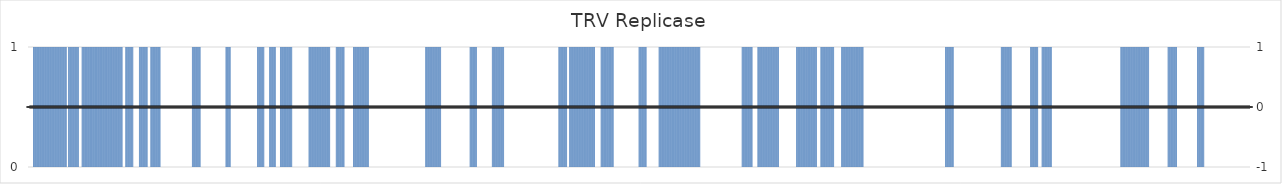
| Category | TRV Replicase |
|---|---|
| 1.0 | 0 |
| 2.0 | 0 |
| 3.0 | 0 |
| 4.0 | 0 |
| 5.0 | 0 |
| 6.0 | 0 |
| 7.0 | 0 |
| 8.0 | 1 |
| 9.0 | 1 |
| 10.0 | 1 |
| 11.0 | 1 |
| 12.0 | 1 |
| 13.0 | 1 |
| 14.0 | 1 |
| 15.0 | 1 |
| 16.0 | 1 |
| 17.0 | 1 |
| 18.0 | 1 |
| 19.0 | 1 |
| 20.0 | 1 |
| 21.0 | 1 |
| 22.0 | 1 |
| 23.0 | 1 |
| 24.0 | 1 |
| 25.0 | 1 |
| 26.0 | 1 |
| 27.0 | 1 |
| 28.0 | 1 |
| 29.0 | 1 |
| 30.0 | 1 |
| 31.0 | 1 |
| 32.0 | 1 |
| 33.0 | 1 |
| 34.0 | 1 |
| 35.0 | 1 |
| 36.0 | 1 |
| 37.0 | 1 |
| 38.0 | 1 |
| 39.0 | 1 |
| 40.0 | 1 |
| 41.0 | 1 |
| 42.0 | 1 |
| 43.0 | 1 |
| 44.0 | 1 |
| 45.0 | 1 |
| 46.0 | 1 |
| 47.0 | 1 |
| 48.0 | 1 |
| 49.0 | 1 |
| 50.0 | 1 |
| 51.0 | 1 |
| 52.0 | 1 |
| 53.0 | 1 |
| 54.0 | 1 |
| 55.0 | 0 |
| 56.0 | 0 |
| 57.0 | 1 |
| 58.0 | 1 |
| 59.0 | 1 |
| 60.0 | 1 |
| 61.0 | 1 |
| 62.0 | 1 |
| 63.0 | 1 |
| 64.0 | 1 |
| 65.0 | 1 |
| 66.0 | 1 |
| 67.0 | 1 |
| 68.0 | 1 |
| 69.0 | 1 |
| 70.0 | 1 |
| 71.0 | 1 |
| 72.0 | 0 |
| 73.0 | 0 |
| 74.0 | 0 |
| 75.0 | 0 |
| 76.0 | 1 |
| 77.0 | 1 |
| 78.0 | 1 |
| 79.0 | 1 |
| 80.0 | 1 |
| 81.0 | 1 |
| 82.0 | 1 |
| 83.0 | 1 |
| 84.0 | 1 |
| 85.0 | 1 |
| 86.0 | 1 |
| 87.0 | 1 |
| 88.0 | 1 |
| 89.0 | 1 |
| 90.0 | 1 |
| 91.0 | 1 |
| 92.0 | 1 |
| 93.0 | 1 |
| 94.0 | 1 |
| 95.0 | 1 |
| 96.0 | 1 |
| 97.0 | 1 |
| 98.0 | 1 |
| 99.0 | 1 |
| 100.0 | 1 |
| 101.0 | 1 |
| 102.0 | 1 |
| 103.0 | 1 |
| 104.0 | 1 |
| 105.0 | 1 |
| 106.0 | 1 |
| 107.0 | 1 |
| 108.0 | 1 |
| 109.0 | 1 |
| 110.0 | 1 |
| 111.0 | 1 |
| 112.0 | 1 |
| 113.0 | 1 |
| 114.0 | 1 |
| 115.0 | 1 |
| 116.0 | 1 |
| 117.0 | 1 |
| 118.0 | 1 |
| 119.0 | 1 |
| 120.0 | 1 |
| 121.0 | 1 |
| 122.0 | 1 |
| 123.0 | 1 |
| 124.0 | 1 |
| 125.0 | 1 |
| 126.0 | 1 |
| 127.0 | 1 |
| 128.0 | 1 |
| 129.0 | 1 |
| 130.0 | 1 |
| 131.0 | 1 |
| 132.0 | 1 |
| 133.0 | 0 |
| 134.0 | 0 |
| 135.0 | 0 |
| 136.0 | 0 |
| 137.0 | 1 |
| 138.0 | 1 |
| 139.0 | 1 |
| 140.0 | 1 |
| 141.0 | 1 |
| 142.0 | 1 |
| 143.0 | 1 |
| 144.0 | 1 |
| 145.0 | 1 |
| 146.0 | 1 |
| 147.0 | 1 |
| 148.0 | 0 |
| 149.0 | 0 |
| 150.0 | 0 |
| 151.0 | 0 |
| 152.0 | 0 |
| 153.0 | 0 |
| 154.0 | 0 |
| 155.0 | 0 |
| 156.0 | 1 |
| 157.0 | 1 |
| 158.0 | 1 |
| 159.0 | 1 |
| 160.0 | 1 |
| 161.0 | 1 |
| 162.0 | 1 |
| 163.0 | 1 |
| 164.0 | 1 |
| 165.0 | 1 |
| 166.0 | 1 |
| 167.0 | 1 |
| 168.0 | 0 |
| 169.0 | 0 |
| 170.0 | 0 |
| 171.0 | 0 |
| 172.0 | 1 |
| 173.0 | 1 |
| 174.0 | 1 |
| 175.0 | 1 |
| 176.0 | 1 |
| 177.0 | 1 |
| 178.0 | 1 |
| 179.0 | 1 |
| 180.0 | 1 |
| 181.0 | 1 |
| 182.0 | 1 |
| 183.0 | 1 |
| 184.0 | 1 |
| 185.0 | 1 |
| 186.0 | 0 |
| 187.0 | 0 |
| 188.0 | 0 |
| 189.0 | 0 |
| 190.0 | 0 |
| 191.0 | 0 |
| 192.0 | 0 |
| 193.0 | 0 |
| 194.0 | 0 |
| 195.0 | 0 |
| 196.0 | 0 |
| 197.0 | 0 |
| 198.0 | 0 |
| 199.0 | 0 |
| 200.0 | 0 |
| 201.0 | 0 |
| 202.0 | 0 |
| 203.0 | 0 |
| 204.0 | 0 |
| 205.0 | 0 |
| 206.0 | 0 |
| 207.0 | 0 |
| 208.0 | 0 |
| 209.0 | 0 |
| 210.0 | 0 |
| 211.0 | 0 |
| 212.0 | 0 |
| 213.0 | 0 |
| 214.0 | 0 |
| 215.0 | 0 |
| 216.0 | 0 |
| 217.0 | 0 |
| 218.0 | 0 |
| 219.0 | 0 |
| 220.0 | 0 |
| 221.0 | 0 |
| 222.0 | 0 |
| 223.0 | 0 |
| 224.0 | 0 |
| 225.0 | 0 |
| 226.0 | 0 |
| 227.0 | 0 |
| 228.0 | 0 |
| 229.0 | 0 |
| 230.0 | 1 |
| 231.0 | 1 |
| 232.0 | 1 |
| 233.0 | 1 |
| 234.0 | 1 |
| 235.0 | 1 |
| 236.0 | 1 |
| 237.0 | 1 |
| 238.0 | 1 |
| 239.0 | 1 |
| 240.0 | 1 |
| 241.0 | 1 |
| 242.0 | 0 |
| 243.0 | 0 |
| 244.0 | 0 |
| 245.0 | 0 |
| 246.0 | 0 |
| 247.0 | 0 |
| 248.0 | 0 |
| 249.0 | 0 |
| 250.0 | 0 |
| 251.0 | 0 |
| 252.0 | 0 |
| 253.0 | 0 |
| 254.0 | 0 |
| 255.0 | 0 |
| 256.0 | 0 |
| 257.0 | 0 |
| 258.0 | 0 |
| 259.0 | 0 |
| 260.0 | 0 |
| 261.0 | 0 |
| 262.0 | 0 |
| 263.0 | 0 |
| 264.0 | 0 |
| 265.0 | 0 |
| 266.0 | 0 |
| 267.0 | 0 |
| 268.0 | 0 |
| 269.0 | 0 |
| 270.0 | 0 |
| 271.0 | 0 |
| 272.0 | 0 |
| 273.0 | 0 |
| 274.0 | 0 |
| 275.0 | 0 |
| 276.0 | 0 |
| 277.0 | 1 |
| 278.0 | 1 |
| 279.0 | 1 |
| 280.0 | 1 |
| 281.0 | 1 |
| 282.0 | 1 |
| 283.0 | 1 |
| 284.0 | 0 |
| 285.0 | 0 |
| 286.0 | 0 |
| 287.0 | 0 |
| 288.0 | 0 |
| 289.0 | 0 |
| 290.0 | 0 |
| 291.0 | 0 |
| 292.0 | 0 |
| 293.0 | 0 |
| 294.0 | 0 |
| 295.0 | 0 |
| 296.0 | 0 |
| 297.0 | 0 |
| 298.0 | 0 |
| 299.0 | 0 |
| 300.0 | 0 |
| 301.0 | 0 |
| 302.0 | 0 |
| 303.0 | 0 |
| 304.0 | 0 |
| 305.0 | 0 |
| 306.0 | 0 |
| 307.0 | 0 |
| 308.0 | 0 |
| 309.0 | 0 |
| 310.0 | 0 |
| 311.0 | 0 |
| 312.0 | 0 |
| 313.0 | 0 |
| 314.0 | 0 |
| 315.0 | 0 |
| 316.0 | 0 |
| 317.0 | 0 |
| 318.0 | 0 |
| 319.0 | 0 |
| 320.0 | 0 |
| 321.0 | 1 |
| 322.0 | 1 |
| 323.0 | 1 |
| 324.0 | 1 |
| 325.0 | 1 |
| 326.0 | 1 |
| 327.0 | 1 |
| 328.0 | 1 |
| 329.0 | 1 |
| 330.0 | 1 |
| 331.0 | 0 |
| 332.0 | 0 |
| 333.0 | 0 |
| 334.0 | 0 |
| 335.0 | 0 |
| 336.0 | 0 |
| 337.0 | 0 |
| 338.0 | 1 |
| 339.0 | 1 |
| 340.0 | 1 |
| 341.0 | 1 |
| 342.0 | 1 |
| 343.0 | 1 |
| 344.0 | 1 |
| 345.0 | 1 |
| 346.0 | 1 |
| 347.0 | 0 |
| 348.0 | 0 |
| 349.0 | 0 |
| 350.0 | 0 |
| 351.0 | 0 |
| 352.0 | 0 |
| 353.0 | 1 |
| 354.0 | 1 |
| 355.0 | 1 |
| 356.0 | 1 |
| 357.0 | 1 |
| 358.0 | 1 |
| 359.0 | 1 |
| 360.0 | 1 |
| 361.0 | 1 |
| 362.0 | 1 |
| 363.0 | 1 |
| 364.0 | 1 |
| 365.0 | 1 |
| 366.0 | 1 |
| 367.0 | 1 |
| 368.0 | 1 |
| 369.0 | 1 |
| 370.0 | 0 |
| 371.0 | 0 |
| 372.0 | 0 |
| 373.0 | 0 |
| 374.0 | 0 |
| 375.0 | 0 |
| 376.0 | 0 |
| 377.0 | 0 |
| 378.0 | 0 |
| 379.0 | 0 |
| 380.0 | 0 |
| 381.0 | 0 |
| 382.0 | 0 |
| 383.0 | 0 |
| 384.0 | 0 |
| 385.0 | 0 |
| 386.0 | 0 |
| 387.0 | 0 |
| 388.0 | 0 |
| 389.0 | 0 |
| 390.0 | 0 |
| 391.0 | 0 |
| 392.0 | 0 |
| 393.0 | 1 |
| 394.0 | 1 |
| 395.0 | 1 |
| 396.0 | 1 |
| 397.0 | 1 |
| 398.0 | 1 |
| 399.0 | 1 |
| 400.0 | 1 |
| 401.0 | 1 |
| 402.0 | 1 |
| 403.0 | 1 |
| 404.0 | 1 |
| 405.0 | 1 |
| 406.0 | 1 |
| 407.0 | 1 |
| 408.0 | 1 |
| 409.0 | 1 |
| 410.0 | 1 |
| 411.0 | 1 |
| 412.0 | 1 |
| 413.0 | 1 |
| 414.0 | 1 |
| 415.0 | 1 |
| 416.0 | 1 |
| 417.0 | 1 |
| 418.0 | 1 |
| 419.0 | 1 |
| 420.0 | 1 |
| 421.0 | 1 |
| 422.0 | 1 |
| 423.0 | 0 |
| 424.0 | 0 |
| 425.0 | 0 |
| 426.0 | 0 |
| 427.0 | 0 |
| 428.0 | 0 |
| 429.0 | 0 |
| 430.0 | 0 |
| 431.0 | 1 |
| 432.0 | 1 |
| 433.0 | 1 |
| 434.0 | 1 |
| 435.0 | 1 |
| 436.0 | 1 |
| 437.0 | 1 |
| 438.0 | 1 |
| 439.0 | 1 |
| 440.0 | 1 |
| 441.0 | 1 |
| 442.0 | 1 |
| 443.0 | 0 |
| 444.0 | 0 |
| 445.0 | 0 |
| 446.0 | 0 |
| 447.0 | 0 |
| 448.0 | 0 |
| 449.0 | 0 |
| 450.0 | 0 |
| 451.0 | 0 |
| 452.0 | 0 |
| 453.0 | 0 |
| 454.0 | 0 |
| 455.0 | 1 |
| 456.0 | 1 |
| 457.0 | 1 |
| 458.0 | 1 |
| 459.0 | 1 |
| 460.0 | 1 |
| 461.0 | 1 |
| 462.0 | 1 |
| 463.0 | 1 |
| 464.0 | 1 |
| 465.0 | 1 |
| 466.0 | 1 |
| 467.0 | 1 |
| 468.0 | 1 |
| 469.0 | 1 |
| 470.0 | 1 |
| 471.0 | 1 |
| 472.0 | 1 |
| 473.0 | 1 |
| 474.0 | 1 |
| 475.0 | 1 |
| 476.0 | 1 |
| 477.0 | 0 |
| 478.0 | 0 |
| 479.0 | 0 |
| 480.0 | 0 |
| 481.0 | 0 |
| 482.0 | 0 |
| 483.0 | 0 |
| 484.0 | 0 |
| 485.0 | 0 |
| 486.0 | 0 |
| 487.0 | 0 |
| 488.0 | 0 |
| 489.0 | 0 |
| 490.0 | 0 |
| 491.0 | 0 |
| 492.0 | 0 |
| 493.0 | 0 |
| 494.0 | 0 |
| 495.0 | 0 |
| 496.0 | 0 |
| 497.0 | 0 |
| 498.0 | 0 |
| 499.0 | 0 |
| 500.0 | 0 |
| 501.0 | 0 |
| 502.0 | 0 |
| 503.0 | 0 |
| 504.0 | 0 |
| 505.0 | 0 |
| 506.0 | 0 |
| 507.0 | 0 |
| 508.0 | 0 |
| 509.0 | 0 |
| 510.0 | 0 |
| 511.0 | 0 |
| 512.0 | 0 |
| 513.0 | 0 |
| 514.0 | 0 |
| 515.0 | 0 |
| 516.0 | 0 |
| 517.0 | 0 |
| 518.0 | 0 |
| 519.0 | 0 |
| 520.0 | 0 |
| 521.0 | 0 |
| 522.0 | 0 |
| 523.0 | 0 |
| 524.0 | 0 |
| 525.0 | 0 |
| 526.0 | 0 |
| 527.0 | 0 |
| 528.0 | 0 |
| 529.0 | 0 |
| 530.0 | 0 |
| 531.0 | 0 |
| 532.0 | 0 |
| 533.0 | 0 |
| 534.0 | 0 |
| 535.0 | 0 |
| 536.0 | 0 |
| 537.0 | 0 |
| 538.0 | 0 |
| 539.0 | 0 |
| 540.0 | 0 |
| 541.0 | 0 |
| 542.0 | 0 |
| 543.0 | 0 |
| 544.0 | 0 |
| 545.0 | 0 |
| 546.0 | 0 |
| 547.0 | 0 |
| 548.0 | 0 |
| 549.0 | 0 |
| 550.0 | 0 |
| 551.0 | 0 |
| 552.0 | 0 |
| 553.0 | 0 |
| 554.0 | 0 |
| 555.0 | 0 |
| 556.0 | 1 |
| 557.0 | 1 |
| 558.0 | 1 |
| 559.0 | 1 |
| 560.0 | 1 |
| 561.0 | 1 |
| 562.0 | 1 |
| 563.0 | 1 |
| 564.0 | 1 |
| 565.0 | 1 |
| 566.0 | 1 |
| 567.0 | 1 |
| 568.0 | 1 |
| 569.0 | 1 |
| 570.0 | 1 |
| 571.0 | 1 |
| 572.0 | 1 |
| 573.0 | 1 |
| 574.0 | 1 |
| 575.0 | 1 |
| 576.0 | 1 |
| 577.0 | 1 |
| 578.0 | 0 |
| 579.0 | 0 |
| 580.0 | 0 |
| 581.0 | 0 |
| 582.0 | 0 |
| 583.0 | 0 |
| 584.0 | 0 |
| 585.0 | 0 |
| 586.0 | 0 |
| 587.0 | 0 |
| 588.0 | 0 |
| 589.0 | 0 |
| 590.0 | 0 |
| 591.0 | 0 |
| 592.0 | 0 |
| 593.0 | 0 |
| 594.0 | 0 |
| 595.0 | 0 |
| 596.0 | 0 |
| 597.0 | 0 |
| 598.0 | 0 |
| 599.0 | 0 |
| 600.0 | 0 |
| 601.0 | 0 |
| 602.0 | 0 |
| 603.0 | 0 |
| 604.0 | 0 |
| 605.0 | 0 |
| 606.0 | 0 |
| 607.0 | 0 |
| 608.0 | 0 |
| 609.0 | 0 |
| 610.0 | 0 |
| 611.0 | 0 |
| 612.0 | 0 |
| 613.0 | 0 |
| 614.0 | 0 |
| 615.0 | 0 |
| 616.0 | 0 |
| 617.0 | 0 |
| 618.0 | 1 |
| 619.0 | 1 |
| 620.0 | 1 |
| 621.0 | 1 |
| 622.0 | 1 |
| 623.0 | 1 |
| 624.0 | 1 |
| 625.0 | 1 |
| 626.0 | 1 |
| 627.0 | 1 |
| 628.0 | 0 |
| 629.0 | 0 |
| 630.0 | 0 |
| 631.0 | 0 |
| 632.0 | 0 |
| 633.0 | 0 |
| 634.0 | 0 |
| 635.0 | 0 |
| 636.0 | 0 |
| 637.0 | 0 |
| 638.0 | 0 |
| 639.0 | 0 |
| 640.0 | 0 |
| 641.0 | 0 |
| 642.0 | 0 |
| 643.0 | 0 |
| 644.0 | 0 |
| 645.0 | 0 |
| 646.0 | 0 |
| 647.0 | 0 |
| 648.0 | 0 |
| 649.0 | 1 |
| 650.0 | 1 |
| 651.0 | 1 |
| 652.0 | 1 |
| 653.0 | 1 |
| 654.0 | 1 |
| 655.0 | 1 |
| 656.0 | 1 |
| 657.0 | 1 |
| 658.0 | 1 |
| 659.0 | 1 |
| 660.0 | 1 |
| 661.0 | 1 |
| 662.0 | 1 |
| 663.0 | 1 |
| 664.0 | 1 |
| 665.0 | 1 |
| 666.0 | 0 |
| 667.0 | 0 |
| 668.0 | 0 |
| 669.0 | 0 |
| 670.0 | 0 |
| 671.0 | 0 |
| 672.0 | 0 |
| 673.0 | 0 |
| 674.0 | 0 |
| 675.0 | 0 |
| 676.0 | 0 |
| 677.0 | 0 |
| 678.0 | 0 |
| 679.0 | 0 |
| 680.0 | 0 |
| 681.0 | 0 |
| 682.0 | 0 |
| 683.0 | 0 |
| 684.0 | 0 |
| 685.0 | 0 |
| 686.0 | 0 |
| 687.0 | 0 |
| 688.0 | 0 |
| 689.0 | 0 |
| 690.0 | 0 |
| 691.0 | 0 |
| 692.0 | 0 |
| 693.0 | 0 |
| 694.0 | 0 |
| 695.0 | 0 |
| 696.0 | 0 |
| 697.0 | 0 |
| 698.0 | 0 |
| 699.0 | 0 |
| 700.0 | 0 |
| 701.0 | 0 |
| 702.0 | 0 |
| 703.0 | 0 |
| 704.0 | 0 |
| 705.0 | 0 |
| 706.0 | 0 |
| 707.0 | 0 |
| 708.0 | 0 |
| 709.0 | 0 |
| 710.0 | 0 |
| 711.0 | 0 |
| 712.0 | 0 |
| 713.0 | 0 |
| 714.0 | 0 |
| 715.0 | 0 |
| 716.0 | 0 |
| 717.0 | 0 |
| 718.0 | 0 |
| 719.0 | 0 |
| 720.0 | 0 |
| 721.0 | 0 |
| 722.0 | 0 |
| 723.0 | 0 |
| 724.0 | 0 |
| 725.0 | 0 |
| 726.0 | 0 |
| 727.0 | 0 |
| 728.0 | 0 |
| 729.0 | 0 |
| 730.0 | 0 |
| 731.0 | 0 |
| 732.0 | 0 |
| 733.0 | 0 |
| 734.0 | 0 |
| 735.0 | 0 |
| 736.0 | 0 |
| 737.0 | 0 |
| 738.0 | 0 |
| 739.0 | 0 |
| 740.0 | 0 |
| 741.0 | 0 |
| 742.0 | 1 |
| 743.0 | 1 |
| 744.0 | 1 |
| 745.0 | 1 |
| 746.0 | 1 |
| 747.0 | 1 |
| 748.0 | 1 |
| 749.0 | 1 |
| 750.0 | 1 |
| 751.0 | 1 |
| 752.0 | 1 |
| 753.0 | 1 |
| 754.0 | 0 |
| 755.0 | 0 |
| 756.0 | 0 |
| 757.0 | 1 |
| 758.0 | 1 |
| 759.0 | 1 |
| 760.0 | 1 |
| 761.0 | 1 |
| 762.0 | 1 |
| 763.0 | 1 |
| 764.0 | 1 |
| 765.0 | 1 |
| 766.0 | 1 |
| 767.0 | 1 |
| 768.0 | 1 |
| 769.0 | 1 |
| 770.0 | 1 |
| 771.0 | 1 |
| 772.0 | 1 |
| 773.0 | 1 |
| 774.0 | 1 |
| 775.0 | 1 |
| 776.0 | 1 |
| 777.0 | 1 |
| 778.0 | 1 |
| 779.0 | 1 |
| 780.0 | 1 |
| 781.0 | 1 |
| 782.0 | 1 |
| 783.0 | 1 |
| 784.0 | 1 |
| 785.0 | 1 |
| 786.0 | 1 |
| 787.0 | 1 |
| 788.0 | 1 |
| 789.0 | 1 |
| 790.0 | 1 |
| 791.0 | 1 |
| 792.0 | 1 |
| 793.0 | 0 |
| 794.0 | 0 |
| 795.0 | 0 |
| 796.0 | 0 |
| 797.0 | 0 |
| 798.0 | 0 |
| 799.0 | 0 |
| 800.0 | 0 |
| 801.0 | 1 |
| 802.0 | 1 |
| 803.0 | 1 |
| 804.0 | 1 |
| 805.0 | 1 |
| 806.0 | 1 |
| 807.0 | 1 |
| 808.0 | 1 |
| 809.0 | 1 |
| 810.0 | 1 |
| 811.0 | 1 |
| 812.0 | 1 |
| 813.0 | 1 |
| 814.0 | 1 |
| 815.0 | 1 |
| 816.0 | 1 |
| 817.0 | 1 |
| 818.0 | 1 |
| 819.0 | 0 |
| 820.0 | 0 |
| 821.0 | 0 |
| 822.0 | 0 |
| 823.0 | 0 |
| 824.0 | 0 |
| 825.0 | 0 |
| 826.0 | 0 |
| 827.0 | 0 |
| 828.0 | 0 |
| 829.0 | 0 |
| 830.0 | 0 |
| 831.0 | 0 |
| 832.0 | 0 |
| 833.0 | 0 |
| 834.0 | 0 |
| 835.0 | 0 |
| 836.0 | 0 |
| 837.0 | 0 |
| 838.0 | 0 |
| 839.0 | 0 |
| 840.0 | 0 |
| 841.0 | 0 |
| 842.0 | 0 |
| 843.0 | 0 |
| 844.0 | 0 |
| 845.0 | 0 |
| 846.0 | 0 |
| 847.0 | 0 |
| 848.0 | 0 |
| 849.0 | 0 |
| 850.0 | 0 |
| 851.0 | 0 |
| 852.0 | 0 |
| 853.0 | 0 |
| 854.0 | 1 |
| 855.0 | 1 |
| 856.0 | 1 |
| 857.0 | 1 |
| 858.0 | 1 |
| 859.0 | 1 |
| 860.0 | 1 |
| 861.0 | 1 |
| 862.0 | 1 |
| 863.0 | 1 |
| 864.0 | 1 |
| 865.0 | 0 |
| 866.0 | 0 |
| 867.0 | 0 |
| 868.0 | 0 |
| 869.0 | 0 |
| 870.0 | 0 |
| 871.0 | 0 |
| 872.0 | 0 |
| 873.0 | 0 |
| 874.0 | 0 |
| 875.0 | 0 |
| 876.0 | 0 |
| 877.0 | 0 |
| 878.0 | 0 |
| 879.0 | 0 |
| 880.0 | 0 |
| 881.0 | 0 |
| 882.0 | 1 |
| 883.0 | 1 |
| 884.0 | 1 |
| 885.0 | 1 |
| 886.0 | 1 |
| 887.0 | 1 |
| 888.0 | 1 |
| 889.0 | 1 |
| 890.0 | 1 |
| 891.0 | 1 |
| 892.0 | 1 |
| 893.0 | 1 |
| 894.0 | 1 |
| 895.0 | 1 |
| 896.0 | 1 |
| 897.0 | 1 |
| 898.0 | 1 |
| 899.0 | 1 |
| 900.0 | 1 |
| 901.0 | 1 |
| 902.0 | 1 |
| 903.0 | 1 |
| 904.0 | 1 |
| 905.0 | 1 |
| 906.0 | 1 |
| 907.0 | 1 |
| 908.0 | 1 |
| 909.0 | 1 |
| 910.0 | 1 |
| 911.0 | 1 |
| 912.0 | 1 |
| 913.0 | 1 |
| 914.0 | 1 |
| 915.0 | 1 |
| 916.0 | 1 |
| 917.0 | 1 |
| 918.0 | 1 |
| 919.0 | 1 |
| 920.0 | 1 |
| 921.0 | 1 |
| 922.0 | 1 |
| 923.0 | 1 |
| 924.0 | 1 |
| 925.0 | 1 |
| 926.0 | 1 |
| 927.0 | 1 |
| 928.0 | 1 |
| 929.0 | 1 |
| 930.0 | 1 |
| 931.0 | 1 |
| 932.0 | 1 |
| 933.0 | 1 |
| 934.0 | 1 |
| 935.0 | 1 |
| 936.0 | 1 |
| 937.0 | 1 |
| 938.0 | 1 |
| 939.0 | 1 |
| 940.0 | 0 |
| 941.0 | 0 |
| 942.0 | 0 |
| 943.0 | 0 |
| 944.0 | 0 |
| 945.0 | 0 |
| 946.0 | 0 |
| 947.0 | 0 |
| 948.0 | 0 |
| 949.0 | 0 |
| 950.0 | 0 |
| 951.0 | 0 |
| 952.0 | 0 |
| 953.0 | 0 |
| 954.0 | 0 |
| 955.0 | 0 |
| 956.0 | 0 |
| 957.0 | 0 |
| 958.0 | 0 |
| 959.0 | 0 |
| 960.0 | 0 |
| 961.0 | 0 |
| 962.0 | 0 |
| 963.0 | 0 |
| 964.0 | 0 |
| 965.0 | 0 |
| 966.0 | 0 |
| 967.0 | 0 |
| 968.0 | 0 |
| 969.0 | 0 |
| 970.0 | 0 |
| 971.0 | 0 |
| 972.0 | 0 |
| 973.0 | 0 |
| 974.0 | 0 |
| 975.0 | 0 |
| 976.0 | 0 |
| 977.0 | 0 |
| 978.0 | 0 |
| 979.0 | 0 |
| 980.0 | 0 |
| 981.0 | 0 |
| 982.0 | 0 |
| 983.0 | 0 |
| 984.0 | 0 |
| 985.0 | 0 |
| 986.0 | 0 |
| 987.0 | 0 |
| 988.0 | 0 |
| 989.0 | 0 |
| 990.0 | 0 |
| 991.0 | 0 |
| 992.0 | 0 |
| 993.0 | 0 |
| 994.0 | 0 |
| 995.0 | 0 |
| 996.0 | 0 |
| 997.0 | 0 |
| 998.0 | 1 |
| 999.0 | 1 |
| 1000.0 | 1 |
| 1001.0 | 1 |
| 1002.0 | 1 |
| 1003.0 | 1 |
| 1004.0 | 1 |
| 1005.0 | 1 |
| 1006.0 | 1 |
| 1007.0 | 1 |
| 1008.0 | 1 |
| 1009.0 | 1 |
| 1010.0 | 1 |
| 1011.0 | 1 |
| 1012.0 | 1 |
| 1013.0 | 0 |
| 1014.0 | 0 |
| 1015.0 | 0 |
| 1016.0 | 0 |
| 1017.0 | 0 |
| 1018.0 | 0 |
| 1019.0 | 0 |
| 1020.0 | 1 |
| 1021.0 | 1 |
| 1022.0 | 1 |
| 1023.0 | 1 |
| 1024.0 | 1 |
| 1025.0 | 1 |
| 1026.0 | 1 |
| 1027.0 | 1 |
| 1028.0 | 1 |
| 1029.0 | 1 |
| 1030.0 | 1 |
| 1031.0 | 1 |
| 1032.0 | 1 |
| 1033.0 | 1 |
| 1034.0 | 1 |
| 1035.0 | 1 |
| 1036.0 | 1 |
| 1037.0 | 1 |
| 1038.0 | 1 |
| 1039.0 | 1 |
| 1040.0 | 1 |
| 1041.0 | 1 |
| 1042.0 | 1 |
| 1043.0 | 1 |
| 1044.0 | 1 |
| 1045.0 | 1 |
| 1046.0 | 1 |
| 1047.0 | 1 |
| 1048.0 | 1 |
| 1049.0 | 1 |
| 1050.0 | 0 |
| 1051.0 | 0 |
| 1052.0 | 0 |
| 1053.0 | 0 |
| 1054.0 | 0 |
| 1055.0 | 0 |
| 1056.0 | 0 |
| 1057.0 | 0 |
| 1058.0 | 0 |
| 1059.0 | 0 |
| 1060.0 | 0 |
| 1061.0 | 0 |
| 1062.0 | 0 |
| 1063.0 | 0 |
| 1064.0 | 0 |
| 1065.0 | 0 |
| 1066.0 | 0 |
| 1067.0 | 0 |
| 1068.0 | 0 |
| 1069.0 | 0 |
| 1070.0 | 0 |
| 1071.0 | 0 |
| 1072.0 | 0 |
| 1073.0 | 0 |
| 1074.0 | 1 |
| 1075.0 | 1 |
| 1076.0 | 1 |
| 1077.0 | 1 |
| 1078.0 | 1 |
| 1079.0 | 1 |
| 1080.0 | 1 |
| 1081.0 | 1 |
| 1082.0 | 1 |
| 1083.0 | 1 |
| 1084.0 | 1 |
| 1085.0 | 1 |
| 1086.0 | 1 |
| 1087.0 | 1 |
| 1088.0 | 1 |
| 1089.0 | 1 |
| 1090.0 | 1 |
| 1091.0 | 1 |
| 1092.0 | 1 |
| 1093.0 | 1 |
| 1094.0 | 1 |
| 1095.0 | 1 |
| 1096.0 | 1 |
| 1097.0 | 1 |
| 1098.0 | 1 |
| 1099.0 | 1 |
| 1100.0 | 1 |
| 1101.0 | 1 |
| 1102.0 | 1 |
| 1103.0 | 0 |
| 1104.0 | 0 |
| 1105.0 | 0 |
| 1106.0 | 0 |
| 1107.0 | 0 |
| 1108.0 | 1 |
| 1109.0 | 1 |
| 1110.0 | 1 |
| 1111.0 | 1 |
| 1112.0 | 1 |
| 1113.0 | 1 |
| 1114.0 | 1 |
| 1115.0 | 1 |
| 1116.0 | 1 |
| 1117.0 | 1 |
| 1118.0 | 1 |
| 1119.0 | 1 |
| 1120.0 | 1 |
| 1121.0 | 1 |
| 1122.0 | 1 |
| 1123.0 | 1 |
| 1124.0 | 1 |
| 1125.0 | 1 |
| 1126.0 | 1 |
| 1127.0 | 0 |
| 1128.0 | 0 |
| 1129.0 | 0 |
| 1130.0 | 0 |
| 1131.0 | 0 |
| 1132.0 | 0 |
| 1133.0 | 0 |
| 1134.0 | 0 |
| 1135.0 | 0 |
| 1136.0 | 0 |
| 1137.0 | 1 |
| 1138.0 | 1 |
| 1139.0 | 1 |
| 1140.0 | 1 |
| 1141.0 | 1 |
| 1142.0 | 1 |
| 1143.0 | 1 |
| 1144.0 | 1 |
| 1145.0 | 1 |
| 1146.0 | 1 |
| 1147.0 | 1 |
| 1148.0 | 1 |
| 1149.0 | 1 |
| 1150.0 | 1 |
| 1151.0 | 1 |
| 1152.0 | 1 |
| 1153.0 | 1 |
| 1154.0 | 1 |
| 1155.0 | 1 |
| 1156.0 | 1 |
| 1157.0 | 1 |
| 1158.0 | 1 |
| 1159.0 | 1 |
| 1160.0 | 1 |
| 1161.0 | 1 |
| 1162.0 | 1 |
| 1163.0 | 1 |
| 1164.0 | 1 |
| 1165.0 | 1 |
| 1166.0 | 1 |
| 1167.0 | 1 |
| 1168.0 | 0 |
| 1169.0 | 0 |
| 1170.0 | 0 |
| 1171.0 | 0 |
| 1172.0 | 0 |
| 1173.0 | 0 |
| 1174.0 | 0 |
| 1175.0 | 0 |
| 1176.0 | 0 |
| 1177.0 | 0 |
| 1178.0 | 0 |
| 1179.0 | 0 |
| 1180.0 | 0 |
| 1181.0 | 0 |
| 1182.0 | 0 |
| 1183.0 | 0 |
| 1184.0 | 0 |
| 1185.0 | 0 |
| 1186.0 | 0 |
| 1187.0 | 0 |
| 1188.0 | 0 |
| 1189.0 | 0 |
| 1190.0 | 0 |
| 1191.0 | 0 |
| 1192.0 | 0 |
| 1193.0 | 0 |
| 1194.0 | 0 |
| 1195.0 | 0 |
| 1196.0 | 0 |
| 1197.0 | 0 |
| 1198.0 | 0 |
| 1199.0 | 0 |
| 1200.0 | 0 |
| 1201.0 | 0 |
| 1202.0 | 0 |
| 1203.0 | 0 |
| 1204.0 | 0 |
| 1205.0 | 0 |
| 1206.0 | 0 |
| 1207.0 | 0 |
| 1208.0 | 0 |
| 1209.0 | 0 |
| 1210.0 | 0 |
| 1211.0 | 0 |
| 1212.0 | 0 |
| 1213.0 | 0 |
| 1214.0 | 0 |
| 1215.0 | 0 |
| 1216.0 | 0 |
| 1217.0 | 0 |
| 1218.0 | 0 |
| 1219.0 | 0 |
| 1220.0 | 0 |
| 1221.0 | 0 |
| 1222.0 | 0 |
| 1223.0 | 0 |
| 1224.0 | 0 |
| 1225.0 | 0 |
| 1226.0 | 0 |
| 1227.0 | 0 |
| 1228.0 | 0 |
| 1229.0 | 0 |
| 1230.0 | 0 |
| 1231.0 | 0 |
| 1232.0 | 0 |
| 1233.0 | 0 |
| 1234.0 | 0 |
| 1235.0 | 0 |
| 1236.0 | 0 |
| 1237.0 | 0 |
| 1238.0 | 0 |
| 1239.0 | 0 |
| 1240.0 | 0 |
| 1241.0 | 0 |
| 1242.0 | 0 |
| 1243.0 | 0 |
| 1244.0 | 0 |
| 1245.0 | 0 |
| 1246.0 | 0 |
| 1247.0 | 0 |
| 1248.0 | 0 |
| 1249.0 | 0 |
| 1250.0 | 0 |
| 1251.0 | 0 |
| 1252.0 | 0 |
| 1253.0 | 0 |
| 1254.0 | 0 |
| 1255.0 | 0 |
| 1256.0 | 0 |
| 1257.0 | 0 |
| 1258.0 | 0 |
| 1259.0 | 0 |
| 1260.0 | 0 |
| 1261.0 | 0 |
| 1262.0 | 0 |
| 1263.0 | 0 |
| 1264.0 | 0 |
| 1265.0 | 0 |
| 1266.0 | 0 |
| 1267.0 | 0 |
| 1268.0 | 0 |
| 1269.0 | 0 |
| 1270.0 | 0 |
| 1271.0 | 0 |
| 1272.0 | 0 |
| 1273.0 | 0 |
| 1274.0 | 0 |
| 1275.0 | 0 |
| 1276.0 | 0 |
| 1277.0 | 0 |
| 1278.0 | 0 |
| 1279.0 | 0 |
| 1280.0 | 0 |
| 1281.0 | 0 |
| 1282.0 | 1 |
| 1283.0 | 1 |
| 1284.0 | 1 |
| 1285.0 | 1 |
| 1286.0 | 1 |
| 1287.0 | 1 |
| 1288.0 | 1 |
| 1289.0 | 1 |
| 1290.0 | 1 |
| 1291.0 | 1 |
| 1292.0 | 1 |
| 1293.0 | 1 |
| 1294.0 | 0 |
| 1295.0 | 0 |
| 1296.0 | 0 |
| 1297.0 | 0 |
| 1298.0 | 0 |
| 1299.0 | 0 |
| 1300.0 | 0 |
| 1301.0 | 0 |
| 1302.0 | 0 |
| 1303.0 | 0 |
| 1304.0 | 0 |
| 1305.0 | 0 |
| 1306.0 | 0 |
| 1307.0 | 0 |
| 1308.0 | 0 |
| 1309.0 | 0 |
| 1310.0 | 0 |
| 1311.0 | 0 |
| 1312.0 | 0 |
| 1313.0 | 0 |
| 1314.0 | 0 |
| 1315.0 | 0 |
| 1316.0 | 0 |
| 1317.0 | 0 |
| 1318.0 | 0 |
| 1319.0 | 0 |
| 1320.0 | 0 |
| 1321.0 | 0 |
| 1322.0 | 0 |
| 1323.0 | 0 |
| 1324.0 | 0 |
| 1325.0 | 0 |
| 1326.0 | 0 |
| 1327.0 | 0 |
| 1328.0 | 0 |
| 1329.0 | 0 |
| 1330.0 | 0 |
| 1331.0 | 0 |
| 1332.0 | 0 |
| 1333.0 | 0 |
| 1334.0 | 0 |
| 1335.0 | 0 |
| 1336.0 | 0 |
| 1337.0 | 0 |
| 1338.0 | 0 |
| 1339.0 | 0 |
| 1340.0 | 0 |
| 1341.0 | 0 |
| 1342.0 | 0 |
| 1343.0 | 0 |
| 1344.0 | 0 |
| 1345.0 | 0 |
| 1346.0 | 0 |
| 1347.0 | 0 |
| 1348.0 | 0 |
| 1349.0 | 0 |
| 1350.0 | 0 |
| 1351.0 | 0 |
| 1352.0 | 0 |
| 1353.0 | 0 |
| 1354.0 | 0 |
| 1355.0 | 0 |
| 1356.0 | 0 |
| 1357.0 | 0 |
| 1358.0 | 0 |
| 1359.0 | 0 |
| 1360.0 | 1 |
| 1361.0 | 1 |
| 1362.0 | 1 |
| 1363.0 | 1 |
| 1364.0 | 1 |
| 1365.0 | 1 |
| 1366.0 | 1 |
| 1367.0 | 1 |
| 1368.0 | 1 |
| 1369.0 | 1 |
| 1370.0 | 1 |
| 1371.0 | 1 |
| 1372.0 | 1 |
| 1373.0 | 1 |
| 1374.0 | 1 |
| 1375.0 | 0 |
| 1376.0 | 0 |
| 1377.0 | 0 |
| 1378.0 | 0 |
| 1379.0 | 0 |
| 1380.0 | 0 |
| 1381.0 | 0 |
| 1382.0 | 0 |
| 1383.0 | 0 |
| 1384.0 | 0 |
| 1385.0 | 0 |
| 1386.0 | 0 |
| 1387.0 | 0 |
| 1388.0 | 0 |
| 1389.0 | 0 |
| 1390.0 | 0 |
| 1391.0 | 0 |
| 1392.0 | 0 |
| 1393.0 | 0 |
| 1394.0 | 0 |
| 1395.0 | 0 |
| 1396.0 | 0 |
| 1397.0 | 0 |
| 1398.0 | 0 |
| 1399.0 | 0 |
| 1400.0 | 0 |
| 1401.0 | 1 |
| 1402.0 | 1 |
| 1403.0 | 1 |
| 1404.0 | 1 |
| 1405.0 | 1 |
| 1406.0 | 1 |
| 1407.0 | 1 |
| 1408.0 | 1 |
| 1409.0 | 1 |
| 1410.0 | 1 |
| 1411.0 | 1 |
| 1412.0 | 0 |
| 1413.0 | 0 |
| 1414.0 | 0 |
| 1415.0 | 0 |
| 1416.0 | 0 |
| 1417.0 | 1 |
| 1418.0 | 1 |
| 1419.0 | 1 |
| 1420.0 | 1 |
| 1421.0 | 1 |
| 1422.0 | 1 |
| 1423.0 | 1 |
| 1424.0 | 1 |
| 1425.0 | 1 |
| 1426.0 | 1 |
| 1427.0 | 1 |
| 1428.0 | 1 |
| 1429.0 | 1 |
| 1430.0 | 1 |
| 1431.0 | 0 |
| 1432.0 | 0 |
| 1433.0 | 0 |
| 1434.0 | 0 |
| 1435.0 | 0 |
| 1436.0 | 0 |
| 1437.0 | 0 |
| 1438.0 | 0 |
| 1439.0 | 0 |
| 1440.0 | 0 |
| 1441.0 | 0 |
| 1442.0 | 0 |
| 1443.0 | 0 |
| 1444.0 | 0 |
| 1445.0 | 0 |
| 1446.0 | 0 |
| 1447.0 | 0 |
| 1448.0 | 0 |
| 1449.0 | 0 |
| 1450.0 | 0 |
| 1451.0 | 0 |
| 1452.0 | 0 |
| 1453.0 | 0 |
| 1454.0 | 0 |
| 1455.0 | 0 |
| 1456.0 | 0 |
| 1457.0 | 0 |
| 1458.0 | 0 |
| 1459.0 | 0 |
| 1460.0 | 0 |
| 1461.0 | 0 |
| 1462.0 | 0 |
| 1463.0 | 0 |
| 1464.0 | 0 |
| 1465.0 | 0 |
| 1466.0 | 0 |
| 1467.0 | 0 |
| 1468.0 | 0 |
| 1469.0 | 0 |
| 1470.0 | 0 |
| 1471.0 | 0 |
| 1472.0 | 0 |
| 1473.0 | 0 |
| 1474.0 | 0 |
| 1475.0 | 0 |
| 1476.0 | 0 |
| 1477.0 | 0 |
| 1478.0 | 0 |
| 1479.0 | 0 |
| 1480.0 | 0 |
| 1481.0 | 0 |
| 1482.0 | 0 |
| 1483.0 | 0 |
| 1484.0 | 0 |
| 1485.0 | 0 |
| 1486.0 | 0 |
| 1487.0 | 0 |
| 1488.0 | 0 |
| 1489.0 | 0 |
| 1490.0 | 0 |
| 1491.0 | 0 |
| 1492.0 | 0 |
| 1493.0 | 0 |
| 1494.0 | 0 |
| 1495.0 | 0 |
| 1496.0 | 0 |
| 1497.0 | 0 |
| 1498.0 | 0 |
| 1499.0 | 0 |
| 1500.0 | 0 |
| 1501.0 | 0 |
| 1502.0 | 0 |
| 1503.0 | 0 |
| 1504.0 | 0 |
| 1505.0 | 0 |
| 1506.0 | 0 |
| 1507.0 | 0 |
| 1508.0 | 0 |
| 1509.0 | 0 |
| 1510.0 | 0 |
| 1511.0 | 0 |
| 1512.0 | 0 |
| 1513.0 | 0 |
| 1514.0 | 0 |
| 1515.0 | 0 |
| 1516.0 | 0 |
| 1517.0 | 0 |
| 1518.0 | 0 |
| 1519.0 | 0 |
| 1520.0 | 0 |
| 1521.0 | 0 |
| 1522.0 | 0 |
| 1523.0 | 0 |
| 1524.0 | 0 |
| 1525.0 | 0 |
| 1526.0 | 0 |
| 1527.0 | 1 |
| 1528.0 | 1 |
| 1529.0 | 1 |
| 1530.0 | 1 |
| 1531.0 | 1 |
| 1532.0 | 1 |
| 1533.0 | 1 |
| 1534.0 | 1 |
| 1535.0 | 1 |
| 1536.0 | 1 |
| 1537.0 | 1 |
| 1538.0 | 1 |
| 1539.0 | 1 |
| 1540.0 | 1 |
| 1541.0 | 1 |
| 1542.0 | 1 |
| 1543.0 | 1 |
| 1544.0 | 1 |
| 1545.0 | 1 |
| 1546.0 | 1 |
| 1547.0 | 1 |
| 1548.0 | 1 |
| 1549.0 | 1 |
| 1550.0 | 1 |
| 1551.0 | 1 |
| 1552.0 | 1 |
| 1553.0 | 1 |
| 1554.0 | 1 |
| 1555.0 | 1 |
| 1556.0 | 1 |
| 1557.0 | 1 |
| 1558.0 | 1 |
| 1559.0 | 1 |
| 1560.0 | 1 |
| 1561.0 | 1 |
| 1562.0 | 1 |
| 1563.0 | 1 |
| 1564.0 | 1 |
| 1565.0 | 1 |
| 1566.0 | 1 |
| 1567.0 | 0 |
| 1568.0 | 0 |
| 1569.0 | 0 |
| 1570.0 | 0 |
| 1571.0 | 0 |
| 1572.0 | 0 |
| 1573.0 | 0 |
| 1574.0 | 0 |
| 1575.0 | 0 |
| 1576.0 | 0 |
| 1577.0 | 0 |
| 1578.0 | 0 |
| 1579.0 | 0 |
| 1580.0 | 0 |
| 1581.0 | 0 |
| 1582.0 | 0 |
| 1583.0 | 0 |
| 1584.0 | 0 |
| 1585.0 | 0 |
| 1586.0 | 0 |
| 1587.0 | 0 |
| 1588.0 | 0 |
| 1589.0 | 0 |
| 1590.0 | 0 |
| 1591.0 | 0 |
| 1592.0 | 0 |
| 1593.0 | 1 |
| 1594.0 | 1 |
| 1595.0 | 1 |
| 1596.0 | 1 |
| 1597.0 | 1 |
| 1598.0 | 1 |
| 1599.0 | 1 |
| 1600.0 | 1 |
| 1601.0 | 1 |
| 1602.0 | 1 |
| 1603.0 | 1 |
| 1604.0 | 1 |
| 1605.0 | 1 |
| 1606.0 | 0 |
| 1607.0 | 0 |
| 1608.0 | 0 |
| 1609.0 | 0 |
| 1610.0 | 0 |
| 1611.0 | 0 |
| 1612.0 | 0 |
| 1613.0 | 0 |
| 1614.0 | 0 |
| 1615.0 | 0 |
| 1616.0 | 0 |
| 1617.0 | 0 |
| 1618.0 | 0 |
| 1619.0 | 0 |
| 1620.0 | 0 |
| 1621.0 | 0 |
| 1622.0 | 0 |
| 1623.0 | 0 |
| 1624.0 | 0 |
| 1625.0 | 0 |
| 1626.0 | 0 |
| 1627.0 | 0 |
| 1628.0 | 0 |
| 1629.0 | 0 |
| 1630.0 | 0 |
| 1631.0 | 0 |
| 1632.0 | 0 |
| 1633.0 | 0 |
| 1634.0 | 1 |
| 1635.0 | 1 |
| 1636.0 | 1 |
| 1637.0 | 1 |
| 1638.0 | 1 |
| 1639.0 | 1 |
| 1640.0 | 1 |
| 1641.0 | 1 |
| 1642.0 | 1 |
| 1643.0 | 1 |
| 1644.0 | 0 |
| 1645.0 | 0 |
| 1646.0 | 0 |
| 1647.0 | 0 |
| 1648.0 | 0 |
| 1649.0 | 0 |
| 1650.0 | 0 |
| 1651.0 | 0 |
| 1652.0 | 0 |
| 1653.0 | 0 |
| 1654.0 | 0 |
| 1655.0 | 0 |
| 1656.0 | 0 |
| 1657.0 | 0 |
| 1658.0 | 0 |
| 1659.0 | 0 |
| 1660.0 | 0 |
| 1661.0 | 0 |
| 1662.0 | 0 |
| 1663.0 | 0 |
| 1664.0 | 0 |
| 1665.0 | 0 |
| 1666.0 | 0 |
| 1667.0 | 0 |
| 1668.0 | 0 |
| 1669.0 | 0 |
| 1670.0 | 0 |
| 1671.0 | 0 |
| 1672.0 | 0 |
| 1673.0 | 0 |
| 1674.0 | 0 |
| 1675.0 | 0 |
| 1676.0 | 0 |
| 1677.0 | 0 |
| 1678.0 | 0 |
| 1679.0 | 0 |
| 1680.0 | 0 |
| 1681.0 | 0 |
| 1682.0 | 0 |
| 1683.0 | 0 |
| 1684.0 | 0 |
| 1685.0 | 0 |
| 1686.0 | 0 |
| 1687.0 | 0 |
| 1688.0 | 0 |
| 1689.0 | 0 |
| 1690.0 | 0 |
| 1691.0 | 0 |
| 1692.0 | 0 |
| 1693.0 | 0 |
| 1694.0 | 0 |
| 1695.0 | 0 |
| 1696.0 | 0 |
| 1697.0 | 0 |
| 1698.0 | 0 |
| 1699.0 | 0 |
| 1700.0 | 0 |
| 1701.0 | 0 |
| 1702.0 | 0 |
| 1703.0 | 0 |
| 1704.0 | 0 |
| 1705.0 | 0 |
| 1706.0 | 0 |
| 1707.0 | 0 |